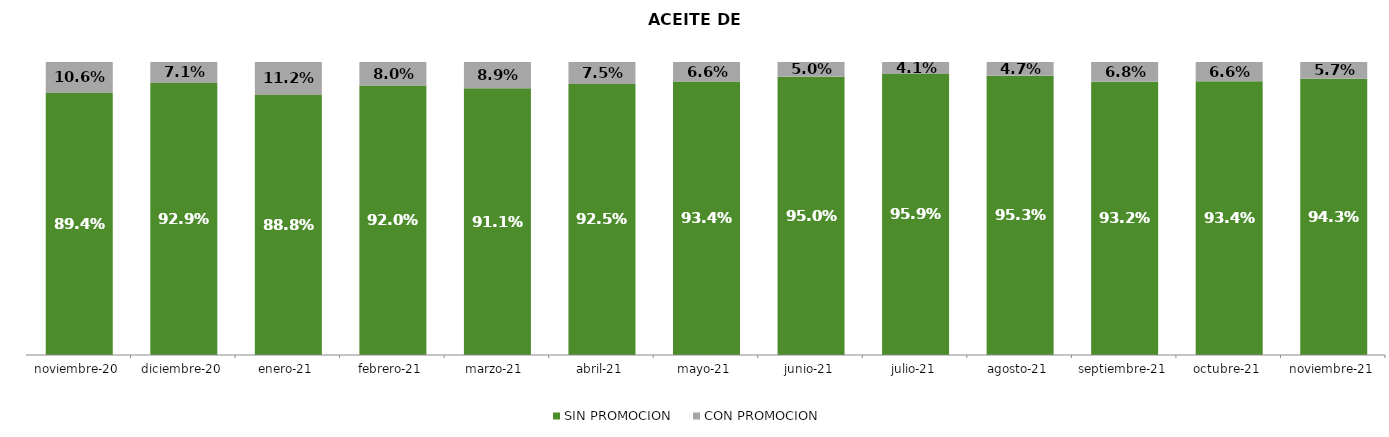
| Category | SIN PROMOCION   | CON PROMOCION   |
|---|---|---|
| 2020-11-01 | 0.894 | 0.106 |
| 2020-12-01 | 0.929 | 0.071 |
| 2021-01-01 | 0.888 | 0.112 |
| 2021-02-01 | 0.92 | 0.08 |
| 2021-03-01 | 0.911 | 0.089 |
| 2021-04-01 | 0.925 | 0.075 |
| 2021-05-01 | 0.934 | 0.066 |
| 2021-06-01 | 0.95 | 0.05 |
| 2021-07-01 | 0.959 | 0.041 |
| 2021-08-01 | 0.953 | 0.047 |
| 2021-09-01 | 0.932 | 0.068 |
| 2021-10-01 | 0.934 | 0.066 |
| 2021-11-01 | 0.943 | 0.057 |